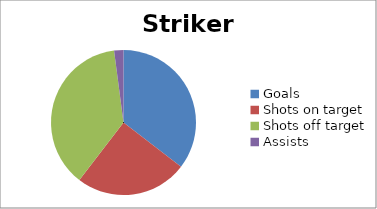
| Category | Striker 4 |
|---|---|
| Goals | 17 |
| Shots on target | 12 |
| Shots off target | 18 |
| Assists | 1 |